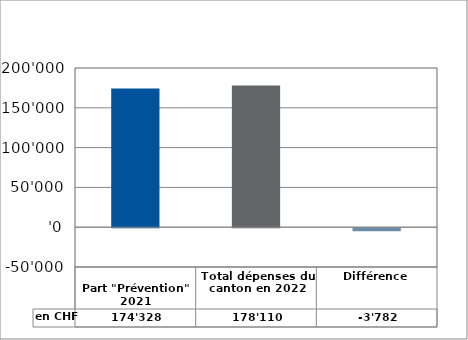
| Category | en CHF |
|---|---|
| 
Part "Prévention" 2021

 | 174328 |
| Total dépenses du canton en 2022 | 178110 |
| Différence | -3782 |